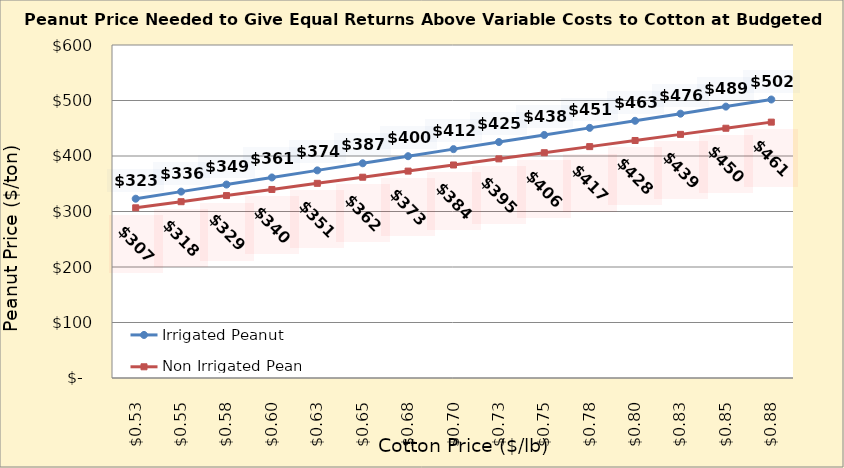
| Category | Irrigated Peanut | Non Irrigated Peanut |
|---|---|---|
| 0.5249999999999998 | 323.04 | 306.622 |
| 0.5499999999999998 | 335.806 | 317.651 |
| 0.5749999999999998 | 348.571 | 328.68 |
| 0.5999999999999999 | 361.337 | 339.71 |
| 0.6249999999999999 | 374.103 | 350.739 |
| 0.6499999999999999 | 386.869 | 361.769 |
| 0.6749999999999999 | 399.635 | 372.798 |
| 0.7 | 412.401 | 383.827 |
| 0.725 | 425.167 | 394.857 |
| 0.75 | 437.933 | 405.886 |
| 0.775 | 450.699 | 416.916 |
| 0.8 | 463.465 | 427.945 |
| 0.8250000000000001 | 476.231 | 438.974 |
| 0.8500000000000001 | 488.997 | 450.004 |
| 0.8750000000000001 | 501.763 | 461.033 |